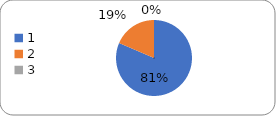
| Category | Series 0 |
|---|---|
| 0 | 101 |
| 1 | 23 |
| 2 | 0 |